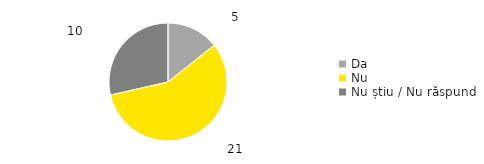
| Category | Total |
|---|---|
| Da | 0.143 |
| Nu | 0.571 |
| Nu știu / Nu răspund | 0.286 |